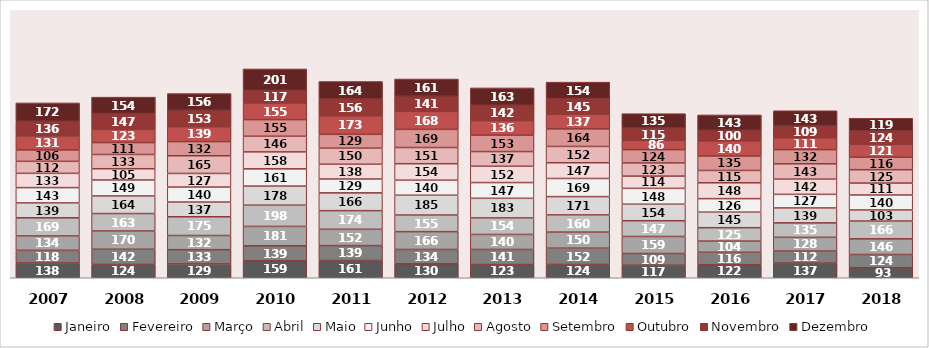
| Category | Janeiro | Fevereiro | Março | Abril | Maio | Junho | Julho | Agosto | Setembro | Outubro | Novembro | Dezembro |
|---|---|---|---|---|---|---|---|---|---|---|---|---|
| 2007 | 138 | 118 | 134 | 169 | 139 | 143 | 133 | 112 | 106 | 131 | 136 | 172 |
| 2008 | 124 | 142 | 170 | 163 | 164 | 149 | 105 | 133 | 111 | 123 | 147 | 154 |
| 2009 | 129 | 133 | 132 | 175 | 137 | 140 | 127 | 165 | 132 | 139 | 153 | 156 |
| 2010 | 159 | 139 | 181 | 198 | 178 | 161 | 158 | 146 | 155 | 155 | 117 | 201 |
| 2011 | 161 | 139 | 152 | 174 | 166 | 129 | 138 | 150 | 129 | 173 | 156 | 164 |
| 2012 | 130 | 134 | 166 | 155 | 185 | 140 | 154 | 151 | 169 | 168 | 141 | 161 |
| 2013 | 123 | 141 | 140 | 154 | 183 | 147 | 152 | 137 | 153 | 136 | 142 | 163 |
| 2014 | 124 | 152 | 150 | 160 | 171 | 169 | 147 | 152 | 164 | 137 | 145 | 154 |
| 2015 | 117 | 109 | 159 | 147 | 154 | 148 | 114 | 123 | 124 | 86 | 115 | 135 |
| 2016 | 122 | 116 | 104 | 125 | 145 | 126 | 148 | 115 | 135 | 140 | 100 | 143 |
| 2017 | 137 | 112 | 128 | 135 | 139 | 127 | 142 | 143 | 132 | 111 | 109 | 143 |
| 2018 | 93 | 124 | 146 | 166 | 103 | 140 | 111 | 125 | 116 | 121 | 124 | 119 |